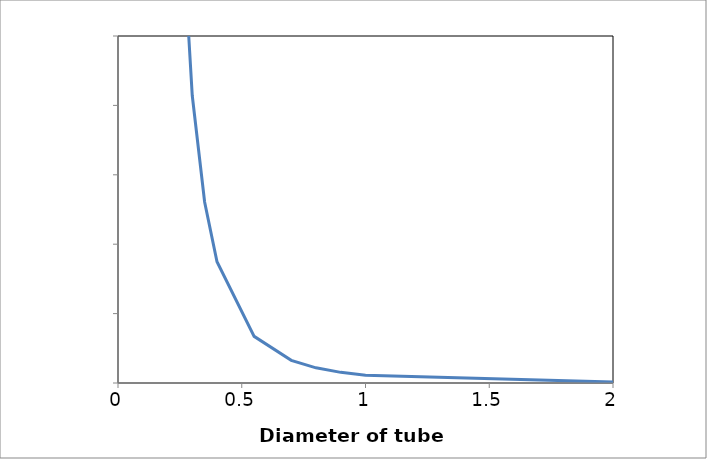
| Category | Series 0 |
|---|---|
| 0.15 | 331400.381 |
| 0.2 | 139809.536 |
| 0.25 | 71582.482 |
| 0.3 | 41425.048 |
| 0.35000000000000003 | 26086.91 |
| 0.4 | 17476.192 |
| 0.55 | 6722.622 |
| 0.7000000000000001 | 3260.864 |
| 0.8 | 2184.524 |
| 0.8999999999999999 | 1534.261 |
| 1.0 | 1118.476 |
| 2.0 | 139.81 |